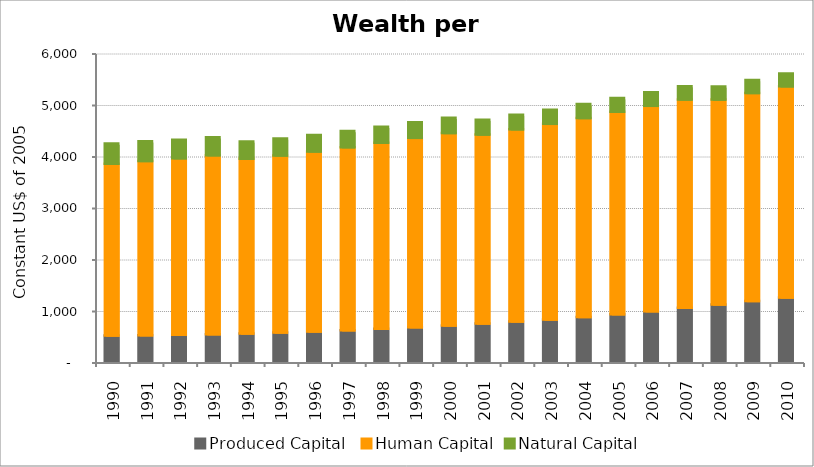
| Category | Produced Capital  | Human Capital | Natural Capital |
|---|---|---|---|
| 1990.0 | 507.497 | 3336.842 | 393.466 |
| 1991.0 | 513.801 | 3385.234 | 382.098 |
| 1992.0 | 522.798 | 3429.88 | 356.997 |
| 1993.0 | 534.555 | 3476.31 | 346.42 |
| 1994.0 | 548.926 | 3393.507 | 336.566 |
| 1995.0 | 565.784 | 3441.215 | 329.033 |
| 1996.0 | 585.946 | 3498.56 | 320.574 |
| 1997.0 | 609.913 | 3556.981 | 314.009 |
| 1998.0 | 638.521 | 3616.307 | 308.253 |
| 1999.0 | 670.809 | 3676.374 | 302.428 |
| 2000.0 | 705.299 | 3736.851 | 294.461 |
| 2001.0 | 740.994 | 3671.526 | 288.201 |
| 2002.0 | 779.811 | 3734.191 | 281.272 |
| 2003.0 | 821.966 | 3798.211 | 275.091 |
| 2004.0 | 869.127 | 3863.883 | 269.645 |
| 2005.0 | 923.301 | 3931.412 | 264.52 |
| 2006.0 | 982.897 | 3987.12 | 260.606 |
| 2007.0 | 1048.399 | 4045.981 | 257.302 |
| 2008.0 | 1112.118 | 3979.659 | 254.163 |
| 2009.0 | 1178.429 | 4041.235 | 251.063 |
| 2010.0 | 1246.401 | 4102.007 | 247.862 |